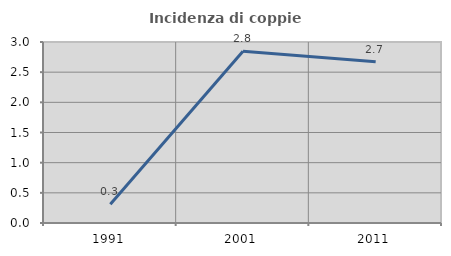
| Category | Incidenza di coppie miste |
|---|---|
| 1991.0 | 0.312 |
| 2001.0 | 2.848 |
| 2011.0 | 2.672 |